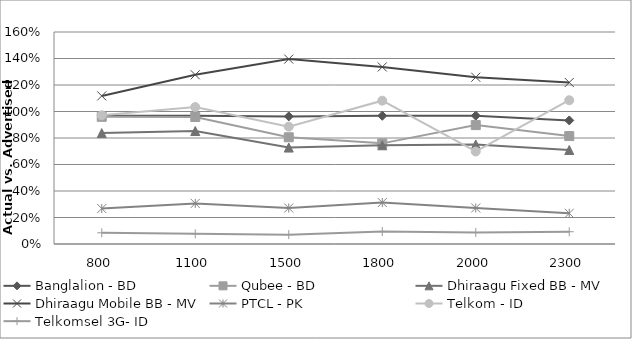
| Category | Banglalion - BD | Qubee - BD | Dhiraagu Fixed BB - MV | Dhiraagu Mobile BB - MV | PTCL - PK | Telkom - ID | Telkomsel 3G- ID |
|---|---|---|---|---|---|---|---|
| 800.0 | 0.968 | 0.96 | 0.837 | 1.118 | 0.268 | 0.971 | 0.085 |
| 1100.0 | 0.969 | 0.958 | 0.853 | 1.277 | 0.306 | 1.033 | 0.077 |
| 1500.0 | 0.963 | 0.806 | 0.728 | 1.395 | 0.272 | 0.886 | 0.071 |
| 1800.0 | 0.968 | 0.76 | 0.745 | 1.336 | 0.313 | 1.082 | 0.094 |
| 2000.0 | 0.968 | 0.898 | 0.751 | 1.259 | 0.272 | 0.698 | 0.087 |
| 2300.0 | 0.933 | 0.814 | 0.709 | 1.219 | 0.232 | 1.085 | 0.093 |